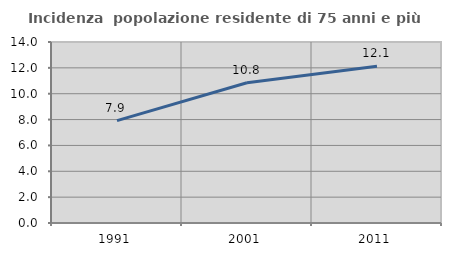
| Category | Incidenza  popolazione residente di 75 anni e più |
|---|---|
| 1991.0 | 7.917 |
| 2001.0 | 10.845 |
| 2011.0 | 12.124 |